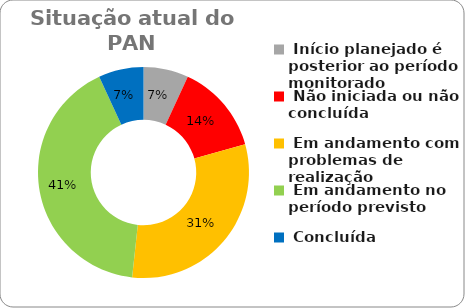
| Category | Series 0 |
|---|---|
|  Início planejado é posterior ao período monitorado | 0.069 |
|  Não iniciada ou não concluída | 0.138 |
|  Em andamento com problemas de realização | 0.31 |
|  Em andamento no período previsto  | 0.414 |
|  Concluída | 0.069 |